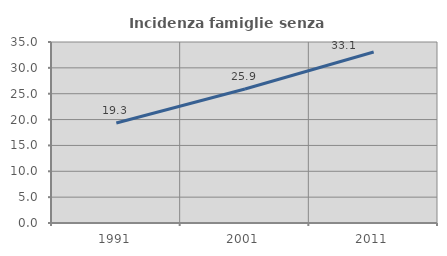
| Category | Incidenza famiglie senza nuclei |
|---|---|
| 1991.0 | 19.332 |
| 2001.0 | 25.917 |
| 2011.0 | 33.06 |